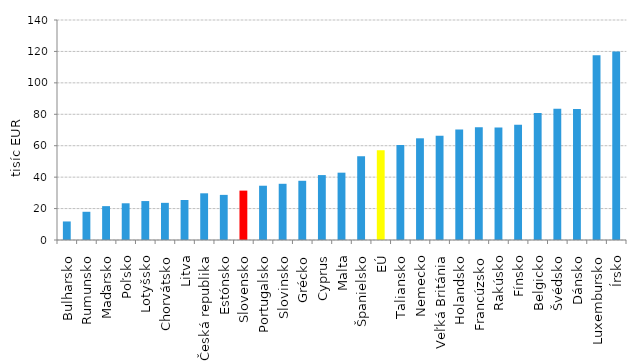
| Category | Series 0 |
|---|---|
| Bulharsko | 11.801 |
| Rumunsko | 17.955 |
| Maďarsko | 21.551 |
| Poľsko | 23.368 |
| Lotyšsko | 24.779 |
| Chorvátsko | 23.645 |
| Litva | 25.45 |
| Česká republika | 29.714 |
| Estónsko | 28.712 |
| Slovensko | 31.422 |
| Portugalsko | 34.538 |
| Slovinsko | 35.769 |
| Grécko | 37.682 |
| Cyprus | 41.31 |
| Malta | 42.846 |
| Španielsko | 53.298 |
| EÚ | 57.04 |
| Taliansko | 60.472 |
| Nemecko | 64.712 |
| Veľká Británia | 66.361 |
| Holandsko | 70.347 |
| Francúzsko | 71.752 |
| Rakúsko | 71.569 |
| Fínsko | 73.293 |
| Belgicko | 80.816 |
| Švédsko | 83.468 |
| Dánsko | 83.427 |
| Luxembursko | 117.544 |
| Írsko | 120.032 |